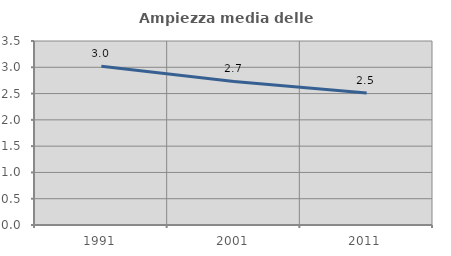
| Category | Ampiezza media delle famiglie |
|---|---|
| 1991.0 | 3.021 |
| 2001.0 | 2.732 |
| 2011.0 | 2.512 |